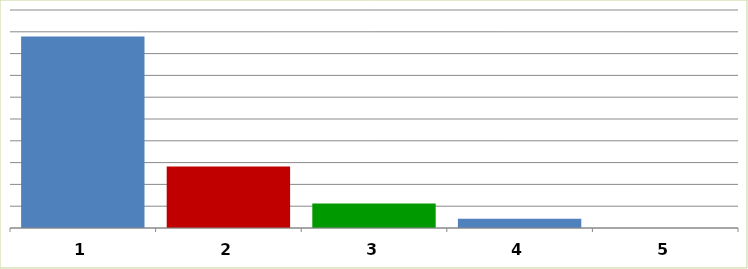
| Category | Series 0 |
|---|---|
| 0 | 43936581.97 |
| 1 | 14128627 |
| 2 | 5592861 |
| 3 | 2096213 |
| 4 | 0 |